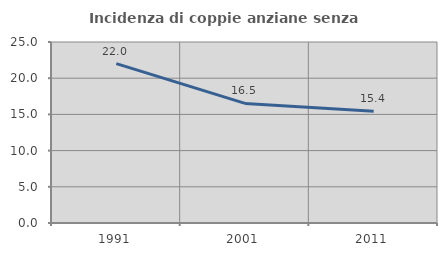
| Category | Incidenza di coppie anziane senza figli  |
|---|---|
| 1991.0 | 22.01 |
| 2001.0 | 16.518 |
| 2011.0 | 15.419 |